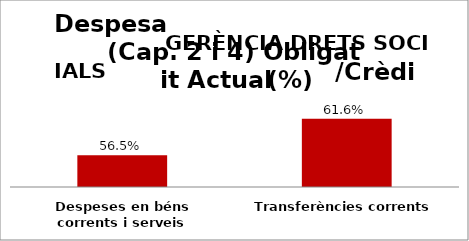
| Category | Series 0 |
|---|---|
| Despeses en béns corrents i serveis | 0.565 |
| Transferències corrents | 0.616 |